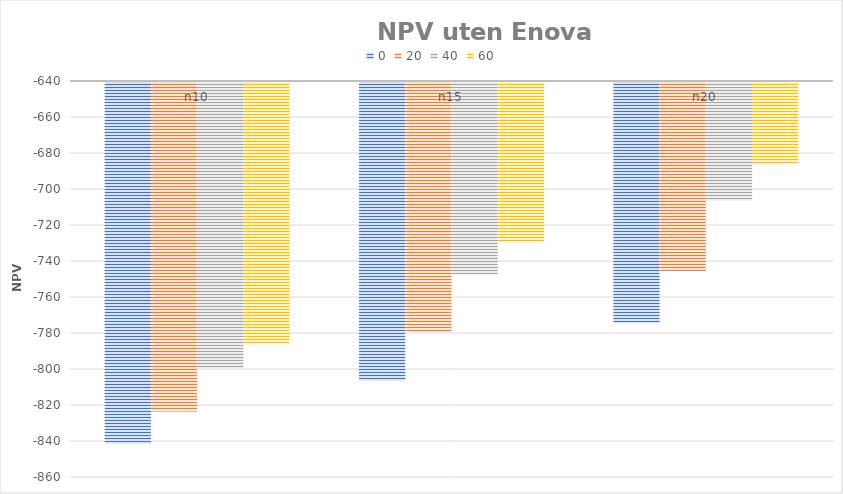
| Category | 0 | 20 | 40 | 60 |
|---|---|---|---|---|
| n10 | -841 | -823 | -799 | -786 |
| n15 | -806 | -779 | -747 | -729 |
| n20 | -774 | -745 | -706 | -686 |